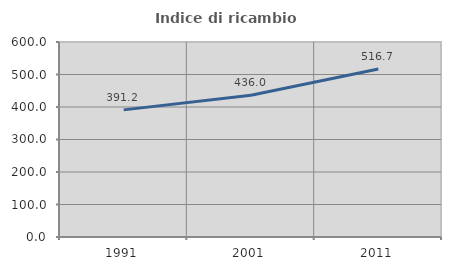
| Category | Indice di ricambio occupazionale  |
|---|---|
| 1991.0 | 391.176 |
| 2001.0 | 436 |
| 2011.0 | 516.667 |